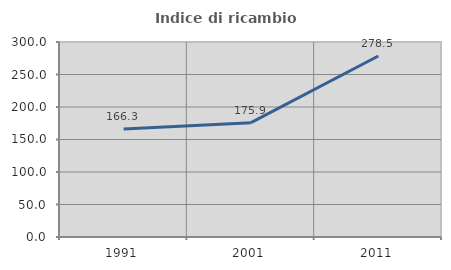
| Category | Indice di ricambio occupazionale  |
|---|---|
| 1991.0 | 166.279 |
| 2001.0 | 175.862 |
| 2011.0 | 278.462 |